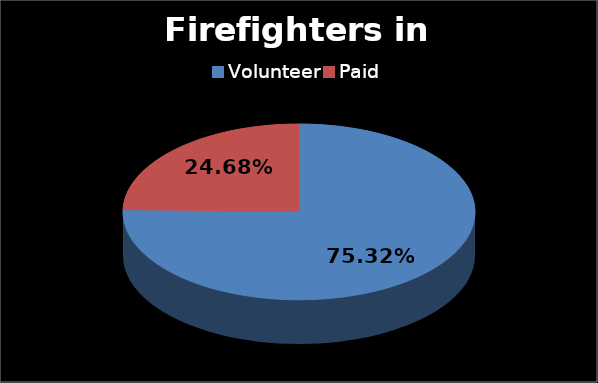
| Category | Series 0 |
|---|---|
| Volunteer | 0.753 |
| Paid | 0.247 |